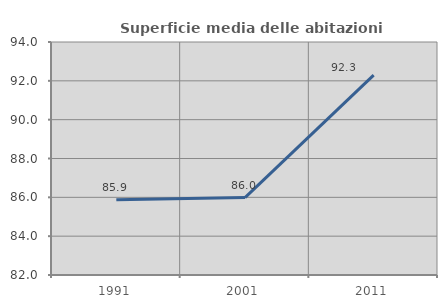
| Category | Superficie media delle abitazioni occupate |
|---|---|
| 1991.0 | 85.87 |
| 2001.0 | 85.988 |
| 2011.0 | 92.293 |